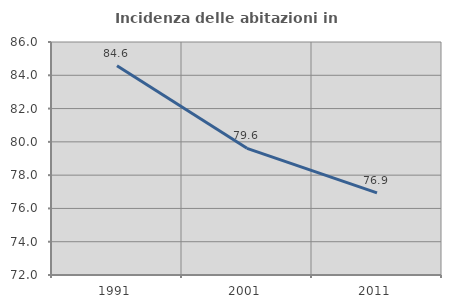
| Category | Incidenza delle abitazioni in proprietà  |
|---|---|
| 1991.0 | 84.577 |
| 2001.0 | 79.612 |
| 2011.0 | 76.939 |